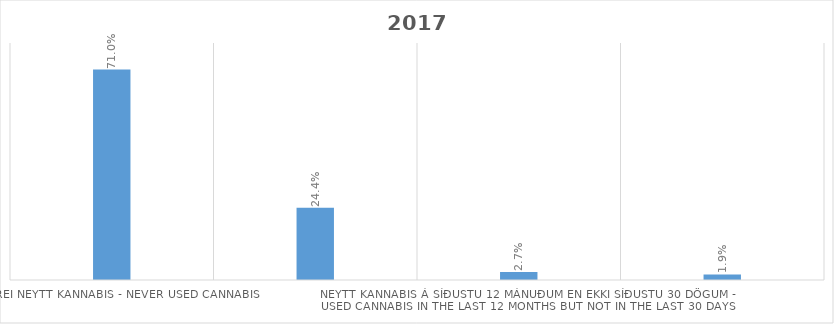
| Category | 2017 |
|---|---|
| Aldrei neytt kannabis - Never used cannabis | 0.71 |
| Neytt kannabis en ekki á síðustu 12 mánuðum - Used cannabis but not in the last 12 months | 0.244 |
| Neytt kannabis á síðustu 12 mánuðum en ekki síðustu 30 dögum - Used cannabis in the last 12 months but not in the last 30 days | 0.027 |
| Neytt kannabis á síðustu 30 dögum - Used cannabis in the last 30 days | 0.019 |